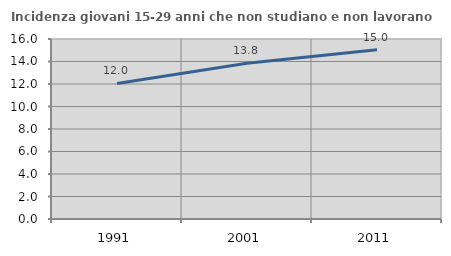
| Category | Incidenza giovani 15-29 anni che non studiano e non lavorano  |
|---|---|
| 1991.0 | 12.05 |
| 2001.0 | 13.846 |
| 2011.0 | 15.041 |